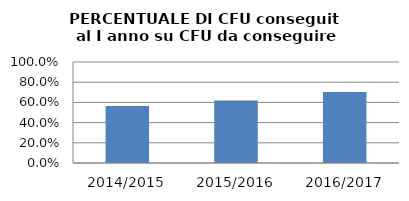
| Category | 2014/2015 2015/2016 2016/2017 |
|---|---|
| 2014/2015 | 0.564 |
| 2015/2016 | 0.619 |
| 2016/2017 | 0.702 |